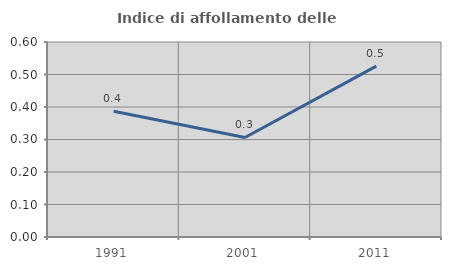
| Category | Indice di affollamento delle abitazioni  |
|---|---|
| 1991.0 | 0.387 |
| 2001.0 | 0.306 |
| 2011.0 | 0.526 |